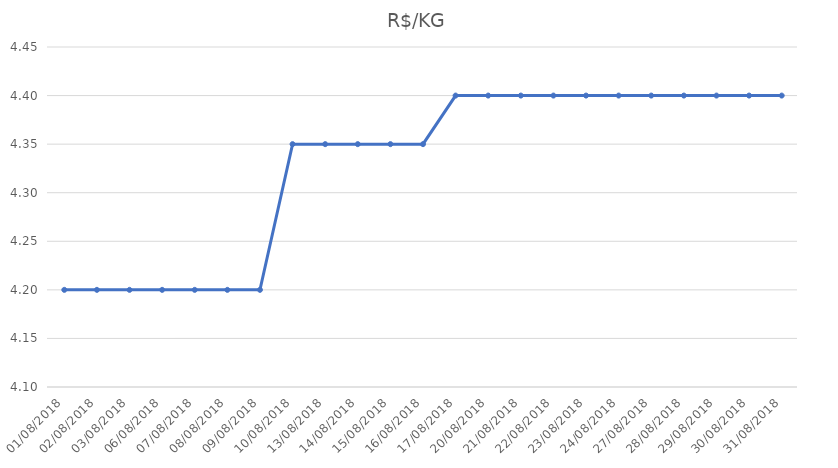
| Category | R$/KG |
|---|---|
| 01/08/2018 | 4.2 |
| 02/08/2018 | 4.2 |
| 03/08/2018 | 4.2 |
| 06/08/2018 | 4.2 |
| 07/08/2018 | 4.2 |
| 08/08/2018 | 4.2 |
| 09/08/2018 | 4.2 |
| 10/08/2018 | 4.35 |
| 13/08/2018 | 4.35 |
| 14/08/2018 | 4.35 |
| 15/08/2018 | 4.35 |
| 16/08/2018 | 4.35 |
| 17/08/2018 | 4.4 |
| 20/08/2018 | 4.4 |
| 21/08/2018 | 4.4 |
| 22/08/2018 | 4.4 |
| 23/08/2018 | 4.4 |
| 24/08/2018 | 4.4 |
| 27/08/2018 | 4.4 |
| 28/08/2018 | 4.4 |
| 29/08/2018 | 4.4 |
| 30/08/2018 | 4.4 |
| 31/08/2018 | 4.4 |